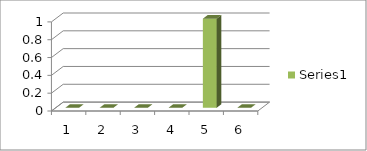
| Category | Series 0 |
|---|---|
| 0 | 0 |
| 1 | 0 |
| 2 | 0 |
| 3 | 0 |
| 4 | 1 |
| 5 | 0 |